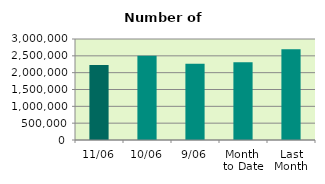
| Category | Series 0 |
|---|---|
| 11/06 | 2231128 |
| 10/06 | 2502762 |
| 9/06 | 2262480 |
| Month 
to Date | 2309226.667 |
| Last
Month | 2692139.333 |